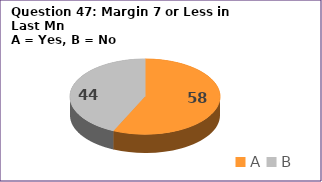
| Category | Series 0 |
|---|---|
| A | 58 |
| B | 44 |